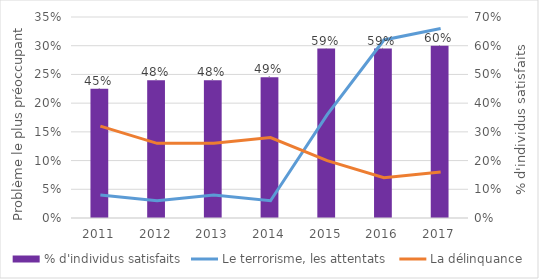
| Category | % d'individus satisfaits |
|---|---|
| 2011.0 | 0.45 |
| 2012.0 | 0.48 |
| 2013.0 | 0.48 |
| 2014.0 | 0.49 |
| 2015.0 | 0.59 |
| 2016.0 | 0.59 |
| 2017.0 | 0.6 |